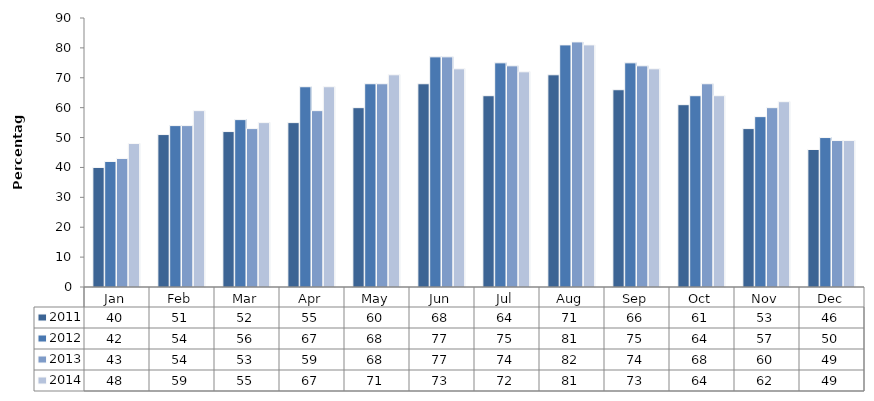
| Category | 2011 | 2012 | 2013 | 2014 |
|---|---|---|---|---|
| Jan | 40 | 42 | 43 | 48 |
| Feb | 51 | 54 | 54 | 59 |
| Mar | 52 | 56 | 53 | 55 |
| Apr | 55 | 67 | 59 | 67 |
| May | 60 | 68 | 68 | 71 |
| Jun | 68 | 77 | 77 | 73 |
| Jul | 64 | 75 | 74 | 72 |
| Aug | 71 | 81 | 82 | 81 |
| Sep | 66 | 75 | 74 | 73 |
| Oct | 61 | 64 | 68 | 64 |
| Nov | 53 | 57 | 60 | 62 |
| Dec | 46 | 50 | 49 | 49 |